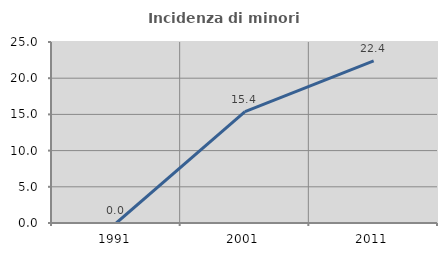
| Category | Incidenza di minori stranieri |
|---|---|
| 1991.0 | 0 |
| 2001.0 | 15.385 |
| 2011.0 | 22.381 |